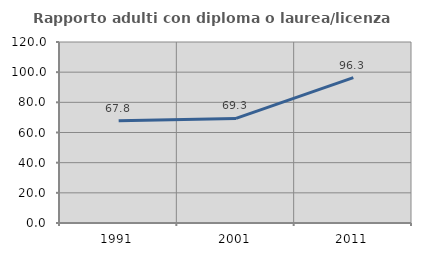
| Category | Rapporto adulti con diploma o laurea/licenza media  |
|---|---|
| 1991.0 | 67.839 |
| 2001.0 | 69.343 |
| 2011.0 | 96.344 |